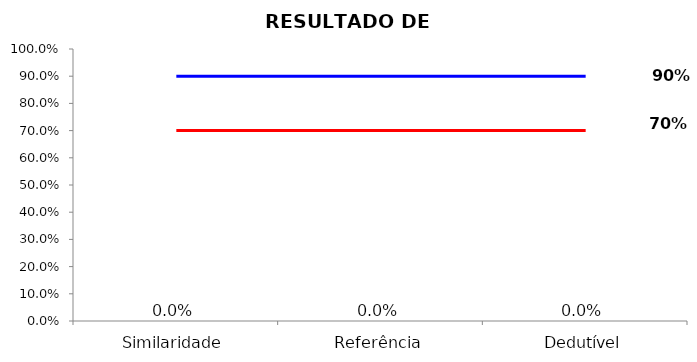
| Category | Series 0 |
|---|---|
| Similaridade | 0 |
| Referência | 0 |
| Dedutível | 0 |